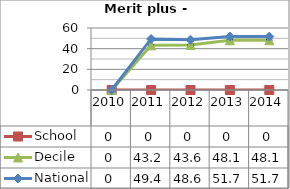
| Category | School  | Decile | National |
|---|---|---|---|
| 2010.0 | 0 | 0 | 0 |
| 2011.0 | 0 | 43.2 | 49.4 |
| 2012.0 | 0 | 43.6 | 48.6 |
| 2013.0 | 0 | 48.1 | 51.7 |
| 2014.0 | 0 | 48.1 | 51.7 |